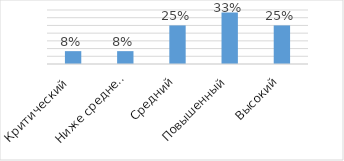
| Category | Series 0 |
|---|---|
| Критический  | 0.083 |
| Ниже среднего | 0.083 |
| Средний | 0.25 |
| Повышенный | 0.333 |
| Высокий | 0.25 |